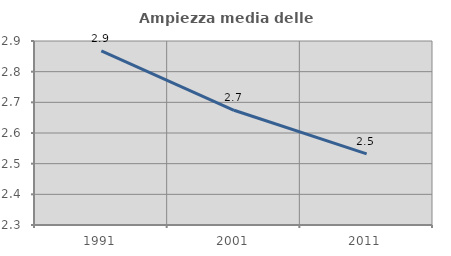
| Category | Ampiezza media delle famiglie |
|---|---|
| 1991.0 | 2.868 |
| 2001.0 | 2.674 |
| 2011.0 | 2.532 |